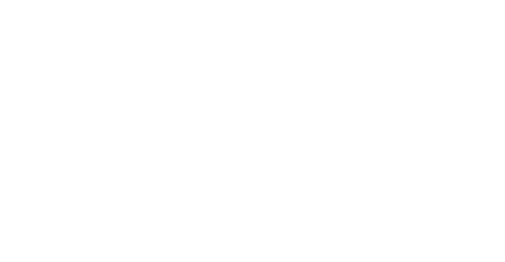
| Category | 0 |
|---|---|
| Fully Vaccinated | 0 |
| Waiting 2nd dose | 0 |
| Received 1st; declined 2nd | 0 |
| Medical contraindication | 0 |
| Declined | 0 |
| Unknown | 0 |